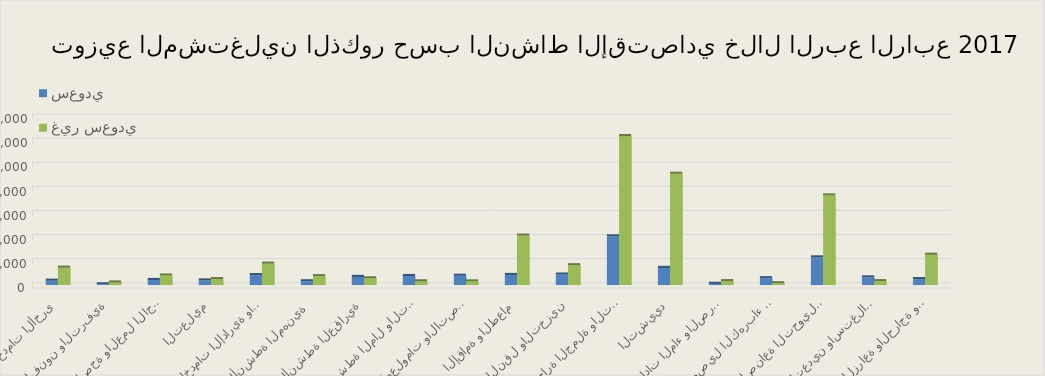
| Category | سعودي        | غير سعودي         |
|---|---|---|
| الزراعة والحراجة وصيد الأسماك | 48972 | 251399 |
| التعدين واستغلال المحاجر | 63371 | 32237 |
| الصناعة التحويلية | 229281 | 743342 |
| توصيل الكهرباء والغاز  | 56269 | 14400 |
| امدادات الماء والصرف الصحي | 10022 | 32221 |
| التشييد | 142092 | 923107 |
| تجارة الجملة والتجزئة | 403925 | 1236321 |
| النقل والتخزين | 86783 | 164109 |
| الإقامة والطعام | 83723 | 409958 |
| المعلومات والاتصالات | 76675 | 29898 |
| أنشطة المال والتأمين | 74807 | 30512 |
| الأنشطة العقارية | 67264 | 55454 |
| الأنشطة المهنية  | 30897 | 73503 |
| الخدمات الإدارية والدعم | 82229 | 177261 |
| التعليم | 38129 | 48869 |
| الصحة والعمل الاجتماعي | 41908 | 78805 |
| الفنون والترفية | 5777 | 20983 |
| الخدمات الأخرى | 35850 | 144018 |